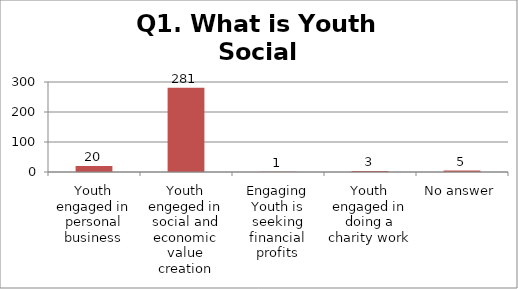
| Category | Q1. What is Youth Social Entrepreneurship? |
|---|---|
| Youth engaged in personal business | 20 |
| Youth engeged in social and economic value creation | 281 |
| Engaging Youth is seeking financial profits | 1 |
| Youth engaged in doing a charity work | 3 |
| No answer | 5 |